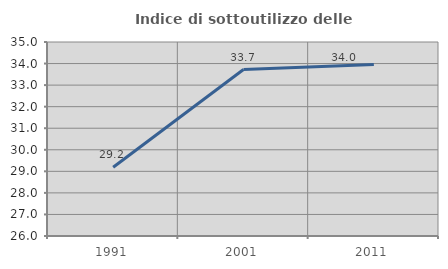
| Category | Indice di sottoutilizzo delle abitazioni  |
|---|---|
| 1991.0 | 29.191 |
| 2001.0 | 33.723 |
| 2011.0 | 33.959 |